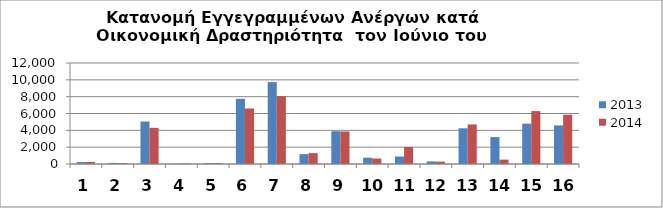
| Category | 2013 | 2014 |
|---|---|---|
| 0 | 231 | 236 |
| 1 | 129 | 97 |
| 2 | 5043 | 4294 |
| 3 | 30 | 63 |
| 4 | 112 | 116 |
| 5 | 7747 | 6597 |
| 6 | 9730 | 8063 |
| 7 | 1177 | 1295 |
| 8 | 3895 | 3864 |
| 9 | 751 | 651 |
| 10 | 887 | 2019 |
| 11 | 308 | 277 |
| 12 | 4242 | 4701 |
| 13 | 3199 | 520 |
| 14 | 4799 | 6283 |
| 15 | 4583 | 5849 |